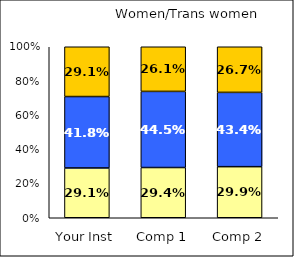
| Category | Low Scholarly Productivity | Average Scholarly Productivity | High Scholarly Productivity |
|---|---|---|---|
| Your Inst | 0.291 | 0.418 | 0.291 |
| Comp 1 | 0.294 | 0.445 | 0.261 |
| Comp 2 | 0.299 | 0.434 | 0.267 |